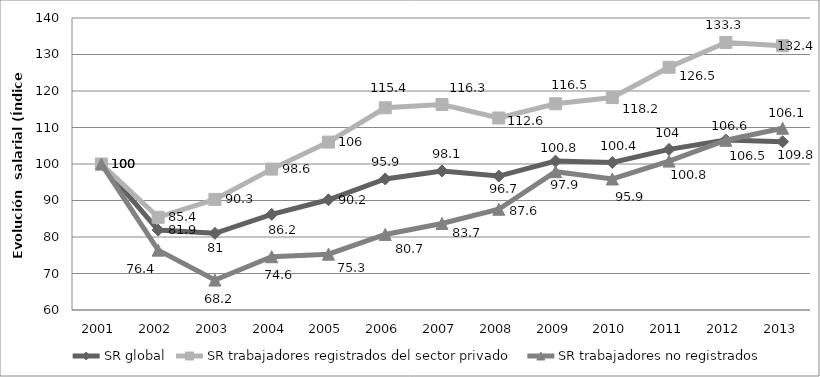
| Category | SR global | SR trabajadores registrados del sector privado | SR trabajadores no registrados |
|---|---|---|---|
| 2001.0 | 100 | 100 | 100 |
| 2002.0 | 81.9 | 85.4 | 76.4 |
| 2003.0 | 81 | 90.3 | 68.2 |
| 2004.0 | 86.2 | 98.6 | 74.6 |
| 2005.0 | 90.2 | 106 | 75.3 |
| 2006.0 | 95.9 | 115.4 | 80.7 |
| 2007.0 | 98.1 | 116.3 | 83.7 |
| 2008.0 | 96.7 | 112.6 | 87.6 |
| 2009.0 | 100.8 | 116.5 | 97.9 |
| 2010.0 | 100.4 | 118.2 | 95.9 |
| 2011.0 | 104 | 126.5 | 100.8 |
| 2012.0 | 106.6 | 133.3 | 106.5 |
| 2013.0 | 106.1 | 132.4 | 109.8 |